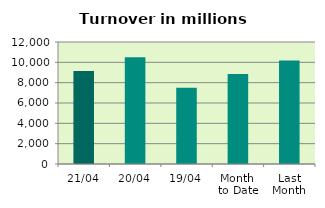
| Category | Series 0 |
|---|---|
| 21/04 | 9149.929 |
| 20/04 | 10504.063 |
| 19/04 | 7493.089 |
| Month 
to Date | 8858.029 |
| Last
Month | 10188.955 |